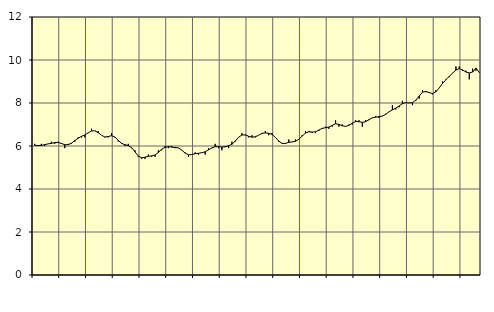
| Category | Piggar | Offentlig förvaltning m.m., SNI 84, 99 |
|---|---|---|
| nan | 6.1 | 6.03 |
| 87.0 | 6 | 6.02 |
| 87.0 | 6.1 | 6.03 |
| 87.0 | 6 | 6.06 |
| nan | 6.1 | 6.1 |
| 88.0 | 6.2 | 6.12 |
| 88.0 | 6.1 | 6.16 |
| 88.0 | 6.2 | 6.16 |
| nan | 6.1 | 6.12 |
| 89.0 | 5.9 | 6.06 |
| 89.0 | 6.1 | 6.06 |
| 89.0 | 6.1 | 6.13 |
| nan | 6.2 | 6.25 |
| 90.0 | 6.4 | 6.36 |
| 90.0 | 6.4 | 6.45 |
| 90.0 | 6.4 | 6.51 |
| nan | 6.6 | 6.61 |
| 91.0 | 6.8 | 6.7 |
| 91.0 | 6.7 | 6.71 |
| 91.0 | 6.7 | 6.62 |
| nan | 6.5 | 6.5 |
| 92.0 | 6.4 | 6.42 |
| 92.0 | 6.4 | 6.44 |
| 92.0 | 6.6 | 6.48 |
| nan | 6.4 | 6.42 |
| 93.0 | 6.2 | 6.26 |
| 93.0 | 6.1 | 6.12 |
| 93.0 | 6 | 6.06 |
| nan | 6.1 | 6.02 |
| 94.0 | 5.9 | 5.92 |
| 94.0 | 5.8 | 5.73 |
| 94.0 | 5.5 | 5.53 |
| nan | 5.4 | 5.45 |
| 95.0 | 5.4 | 5.48 |
| 95.0 | 5.6 | 5.52 |
| 95.0 | 5.5 | 5.54 |
| nan | 5.5 | 5.58 |
| 96.0 | 5.8 | 5.7 |
| 96.0 | 5.8 | 5.85 |
| 96.0 | 6 | 5.94 |
| nan | 5.9 | 5.97 |
| 97.0 | 6 | 5.95 |
| 97.0 | 5.9 | 5.93 |
| 97.0 | 5.9 | 5.91 |
| nan | 5.8 | 5.81 |
| 98.0 | 5.7 | 5.67 |
| 98.0 | 5.5 | 5.59 |
| 98.0 | 5.6 | 5.6 |
| nan | 5.7 | 5.64 |
| 99.0 | 5.6 | 5.66 |
| 99.0 | 5.7 | 5.69 |
| 99.0 | 5.6 | 5.73 |
| nan | 5.9 | 5.82 |
| 0.0 | 5.9 | 5.91 |
| 0.0 | 6.1 | 5.97 |
| 0.0 | 5.9 | 5.97 |
| nan | 5.8 | 5.95 |
| 1.0 | 6 | 5.96 |
| 1.0 | 5.9 | 6.01 |
| 1.0 | 6.2 | 6.08 |
| nan | 6.2 | 6.23 |
| 2.0 | 6.4 | 6.41 |
| 2.0 | 6.6 | 6.51 |
| 2.0 | 6.5 | 6.52 |
| nan | 6.4 | 6.45 |
| 3.0 | 6.5 | 6.41 |
| 3.0 | 6.4 | 6.43 |
| 3.0 | 6.5 | 6.5 |
| nan | 6.6 | 6.59 |
| 4.0 | 6.7 | 6.61 |
| 4.0 | 6.5 | 6.59 |
| 4.0 | 6.6 | 6.54 |
| nan | 6.4 | 6.4 |
| 5.0 | 6.2 | 6.23 |
| 5.0 | 6.1 | 6.12 |
| 5.0 | 6.1 | 6.12 |
| nan | 6.3 | 6.17 |
| 6.0 | 6.2 | 6.19 |
| 6.0 | 6.3 | 6.22 |
| 6.0 | 6.3 | 6.31 |
| nan | 6.5 | 6.46 |
| 7.0 | 6.7 | 6.6 |
| 7.0 | 6.7 | 6.66 |
| 7.0 | 6.6 | 6.65 |
| nan | 6.6 | 6.66 |
| 8.0 | 6.7 | 6.74 |
| 8.0 | 6.8 | 6.82 |
| 8.0 | 6.9 | 6.85 |
| nan | 6.8 | 6.88 |
| 9.0 | 6.9 | 6.96 |
| 9.0 | 7.2 | 7.03 |
| 9.0 | 6.9 | 7.01 |
| nan | 7 | 6.94 |
| 10.0 | 6.9 | 6.91 |
| 10.0 | 7 | 6.96 |
| 10.0 | 7 | 7.06 |
| nan | 7.2 | 7.14 |
| 11.0 | 7.2 | 7.13 |
| 11.0 | 6.9 | 7.1 |
| 11.0 | 7.2 | 7.13 |
| nan | 7.2 | 7.23 |
| 12.0 | 7.3 | 7.31 |
| 12.0 | 7.4 | 7.34 |
| 12.0 | 7.3 | 7.37 |
| nan | 7.4 | 7.39 |
| 13.0 | 7.5 | 7.47 |
| 13.0 | 7.6 | 7.59 |
| 13.0 | 7.9 | 7.68 |
| nan | 7.7 | 7.76 |
| 14.0 | 7.8 | 7.86 |
| 14.0 | 8.1 | 7.97 |
| 14.0 | 8 | 8.02 |
| nan | 8 | 8 |
| 15.0 | 7.9 | 8.02 |
| 15.0 | 8.1 | 8.13 |
| 15.0 | 8.2 | 8.32 |
| nan | 8.6 | 8.5 |
| 16.0 | 8.5 | 8.54 |
| 16.0 | 8.5 | 8.48 |
| 16.0 | 8.4 | 8.44 |
| nan | 8.6 | 8.52 |
| 17.0 | 8.7 | 8.7 |
| 17.0 | 9 | 8.91 |
| 17.0 | 9.1 | 9.08 |
| nan | 9.2 | 9.24 |
| 18.0 | 9.4 | 9.39 |
| 18.0 | 9.7 | 9.53 |
| 18.0 | 9.7 | 9.6 |
| nan | 9.5 | 9.54 |
| 19.0 | 9.5 | 9.44 |
| 19.0 | 9.1 | 9.4 |
| 19.0 | 9.6 | 9.44 |
| nan | 9.5 | 9.63 |
| 20.0 | 9.4 | 9.41 |